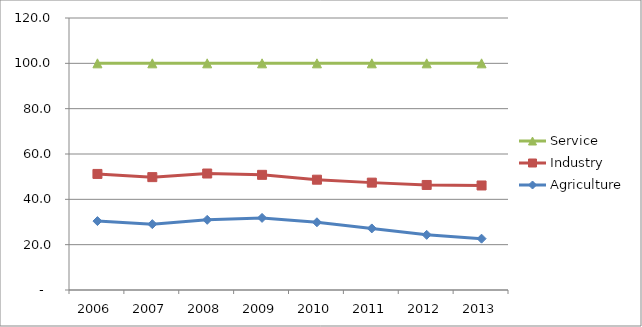
| Category | Agriculture | Industry | Service |
|---|---|---|---|
| 2006.0 | 30.405 | 20.799 | 48.796 |
| 2007.0 | 29.05 | 20.747 | 50.203 |
| 2008.0 | 30.962 | 20.425 | 48.614 |
| 2009.0 | 31.806 | 19 | 49.194 |
| 2010.0 | 29.876 | 18.785 | 51.339 |
| 2011.0 | 27.166 | 20.205 | 52.629 |
| 2012.0 | 24.328 | 22.016 | 53.656 |
| 2013.0 | 22.642 | 23.473 | 53.885 |